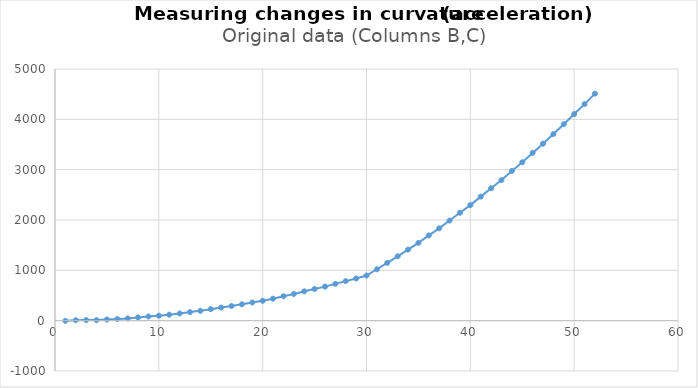
| Category | Series 0 |
|---|---|
| 1.0 | -3.494 |
| 2.0 | 8.832 |
| 3.0 | 12.108 |
| 4.0 | 11.64 |
| 5.0 | 23.133 |
| 6.0 | 31.951 |
| 7.0 | 45.371 |
| 8.0 | 64.704 |
| 9.0 | 83.192 |
| 10.0 | 99.359 |
| 11.0 | 118.06 |
| 12.0 | 142.069 |
| 13.0 | 170.279 |
| 14.0 | 195.277 |
| 15.0 | 228.163 |
| 16.0 | 259.471 |
| 17.0 | 291.303 |
| 18.0 | 325.631 |
| 19.0 | 361.112 |
| 20.0 | 395.136 |
| 21.0 | 437.101 |
| 22.0 | 485.537 |
| 23.0 | 530.494 |
| 24.0 | 582.807 |
| 25.0 | 628.906 |
| 26.0 | 676.791 |
| 27.0 | 731.314 |
| 28.0 | 786.015 |
| 29.0 | 839.017 |
| 30.0 | 896.518 |
| 31.0 | 1021.401 |
| 32.0 | 1147.805 |
| 33.0 | 1278.526 |
| 34.0 | 1411.436 |
| 35.0 | 1546.261 |
| 36.0 | 1693.705 |
| 37.0 | 1834.62 |
| 38.0 | 1989.388 |
| 39.0 | 2143.793 |
| 40.0 | 2295.601 |
| 41.0 | 2464.725 |
| 42.0 | 2630.891 |
| 43.0 | 2792.626 |
| 44.0 | 2973.987 |
| 45.0 | 3147.196 |
| 46.0 | 3332.201 |
| 47.0 | 3516.447 |
| 48.0 | 3707.012 |
| 49.0 | 3903.718 |
| 50.0 | 4104.72 |
| 51.0 | 4301.751 |
| 52.0 | 4509.962 |